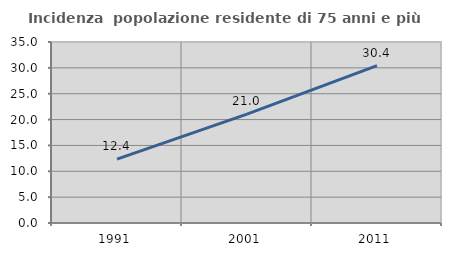
| Category | Incidenza  popolazione residente di 75 anni e più |
|---|---|
| 1991.0 | 12.361 |
| 2001.0 | 21.042 |
| 2011.0 | 30.435 |